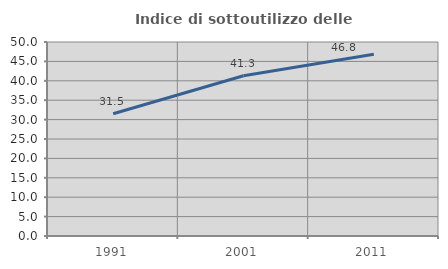
| Category | Indice di sottoutilizzo delle abitazioni  |
|---|---|
| 1991.0 | 31.495 |
| 2001.0 | 41.304 |
| 2011.0 | 46.821 |